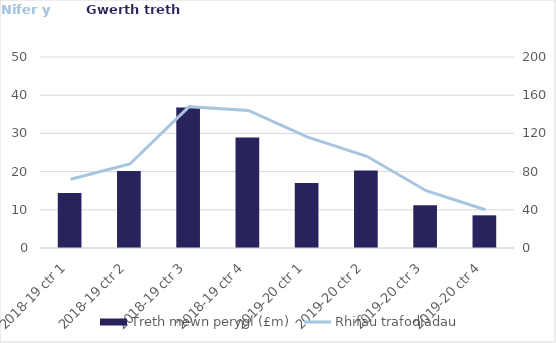
| Category | Treth mewn perygl (£m) |
|---|---|
| 2018-19 ctr 1 | 57529.32 |
| 2018-19 ctr 2 | 80608.5 |
| 2018-19 ctr 3 | 147208.5 |
| 2018-19 ctr 4 | 115650 |
| 2019-20 ctr 1 | 68135.64 |
| 2019-20 ctr 2 | 81239.5 |
| 2019-20 ctr 3 | 44698.5 |
| 2019-20 ctr 4 | 34215 |